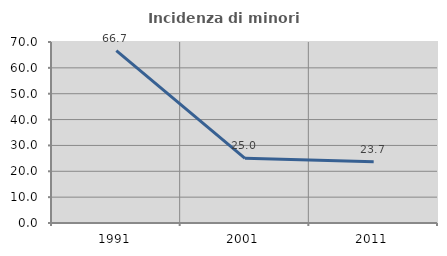
| Category | Incidenza di minori stranieri |
|---|---|
| 1991.0 | 66.667 |
| 2001.0 | 25 |
| 2011.0 | 23.718 |